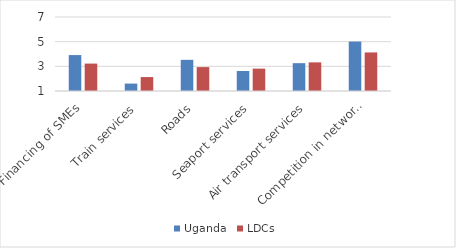
| Category | Uganda | LDCs |
|---|---|---|
| Financing of SMEs | 3.913 | 3.223 |
| Train services | 1.601 | 2.129 |
| Roads | 3.526 | 2.938 |
| Seaport services | 2.619 | 2.815 |
| Air transport services | 3.256 | 3.321 |
| Competition in network services | 5.009 | 4.126 |